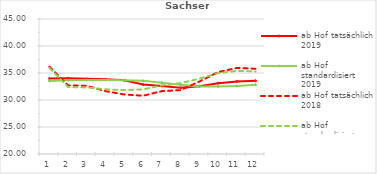
| Category | ab Hof tatsächlich 2019 | ab Hof standardisiert 2019 | ab Hof tatsächlich 2018 | ab Hof standardisiert 2018 |
|---|---|---|---|---|
| 0 | 33.978 | 33.525 | 36.157 | 35.957 |
| 1 | 34.026 | 33.666 | 32.714 | 32.405 |
| 2 | 33.915 | 33.696 | 32.609 | 32.322 |
| 3 | 33.848 | 33.69 | 31.642 | 31.976 |
| 4 | 33.646 | 33.662 | 31.023 | 31.833 |
| 5 | 32.859 | 33.544 | 30.795 | 31.967 |
| 6 | 32.572 | 33.202 | 31.646 | 32.715 |
| 7 | 32.274 | 32.843 | 31.828 | 33.122 |
| 8 | 32.548 | 32.499 | 33.424 | 33.952 |
| 9 | 33.118 | 32.516 | 35.165 | 34.974 |
| 10 | 33.446 | 32.596 | 35.938 | 35.405 |
| 11 | 33.551 | 32.808 | 35.785 | 35.278 |